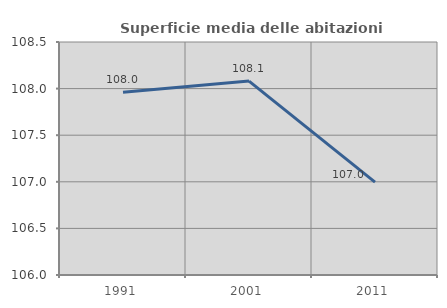
| Category | Superficie media delle abitazioni occupate |
|---|---|
| 1991.0 | 107.96 |
| 2001.0 | 108.081 |
| 2011.0 | 106.996 |